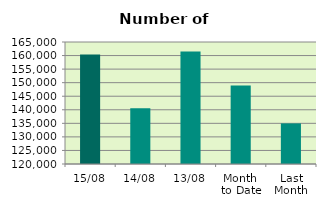
| Category | Series 0 |
|---|---|
| 15/08 | 160386 |
| 14/08 | 140566 |
| 13/08 | 161510 |
| Month 
to Date | 148956.364 |
| Last
Month | 134976 |